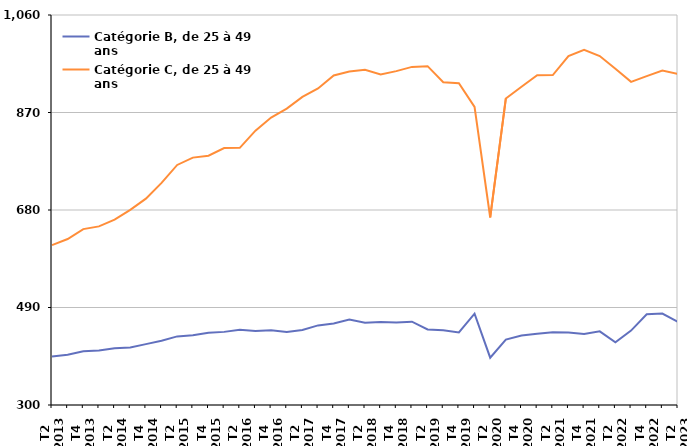
| Category | Catégorie B, de 25 à 49 ans | Catégorie C, de 25 à 49 ans |
|---|---|---|
| T2
2013 | 394.6 | 611.5 |
| T3
2013 | 398 | 623.4 |
| T4
2013 | 404.8 | 642.8 |
| T1
2014 | 406.2 | 648.1 |
| T2
2014 | 410.8 | 661.4 |
| T3
2014 | 412.1 | 680.3 |
| T4
2014 | 418.6 | 702.1 |
| T1
2015 | 425.1 | 732.9 |
| T2
2015 | 433.7 | 767.8 |
| T3
2015 | 436 | 782.1 |
| T4
2015 | 440.8 | 785.9 |
| T1
2016 | 442.5 | 800.6 |
| T2
2016 | 446.5 | 801.2 |
| T3
2016 | 444.3 | 834.7 |
| T4
2016 | 445.5 | 860.1 |
| T1
2017 | 442.3 | 877.5 |
| T2
2017 | 446.2 | 900.3 |
| T3
2017 | 455.1 | 916.8 |
| T4
2017 | 458.9 | 942.2 |
| T1
2018 | 466.4 | 950 |
| T2
2018 | 460.2 | 953.1 |
| T3
2018 | 461.6 | 944.1 |
| T4
2018 | 460.7 | 950.6 |
| T1
2019 | 462.3 | 958.9 |
| T2
2019 | 447.3 | 960.3 |
| T3
2019 | 445.6 | 928.9 |
| T4
2019 | 441.4 | 927 |
| T1
2020 | 477.9 | 880.9 |
| T2
2020 | 392.2 | 665.4 |
| T3
2020 | 427.5 | 897.4 |
| T4
2020 | 435.4 | 920.1 |
| T1
2021 | 438.7 | 942.8 |
| T2
2021 | 441.9 | 943 |
| T3
2021 | 441.2 | 979.9 |
| T4
2021 | 438.4 | 992 |
| T1
2022 | 443.5 | 980.1 |
| T2
2022 | 422.1 | 955.3 |
| T3
2022 | 445 | 929.7 |
| T4
2022 | 476.9 | 940.9 |
| T1
2023 | 478.1 | 951.9 |
| T2
2023 | 462.1 | 945 |